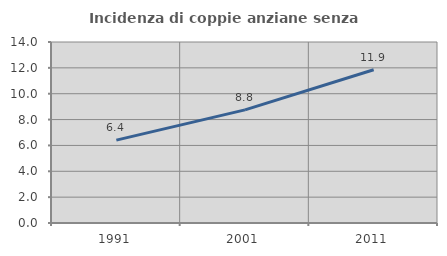
| Category | Incidenza di coppie anziane senza figli  |
|---|---|
| 1991.0 | 6.413 |
| 2001.0 | 8.75 |
| 2011.0 | 11.855 |